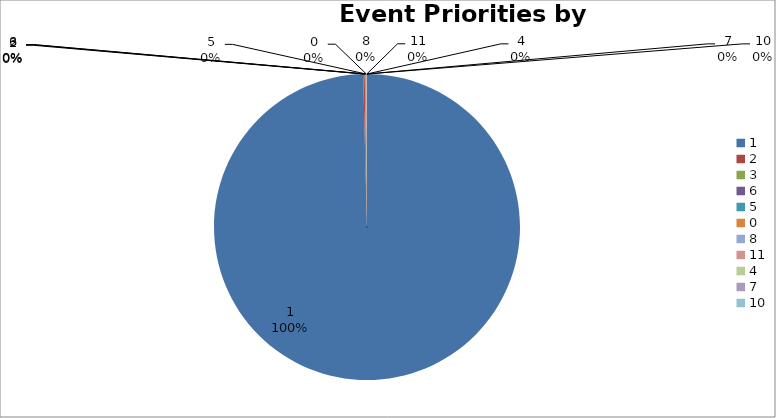
| Category | Series 0 |
|---|---|
| 1.0 | 155869 |
| 2.0 | 260 |
| 3.0 | 109 |
| 6.0 | 63 |
| 5.0 | 62 |
| 0.0 | 44 |
| 8.0 | 36 |
| 11.0 | 34 |
| 4.0 | 9 |
| 7.0 | 5 |
| 10.0 | 3 |